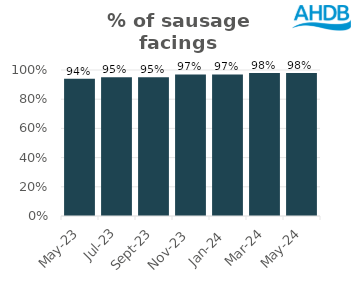
| Category | Sausage |
|---|---|
| 2023-05-01 | 0.94 |
| 2023-07-01 | 0.95 |
| 2023-09-01 | 0.95 |
| 2023-11-01 | 0.97 |
| 2024-01-01 | 0.97 |
| 2024-03-01 | 0.98 |
| 2024-05-01 | 0.98 |